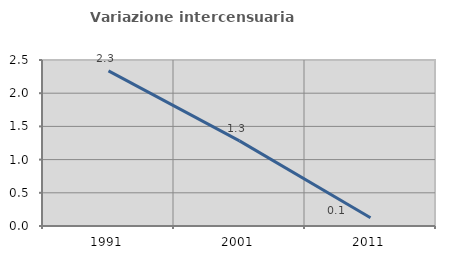
| Category | Variazione intercensuaria annua |
|---|---|
| 1991.0 | 2.336 |
| 2001.0 | 1.282 |
| 2011.0 | 0.124 |